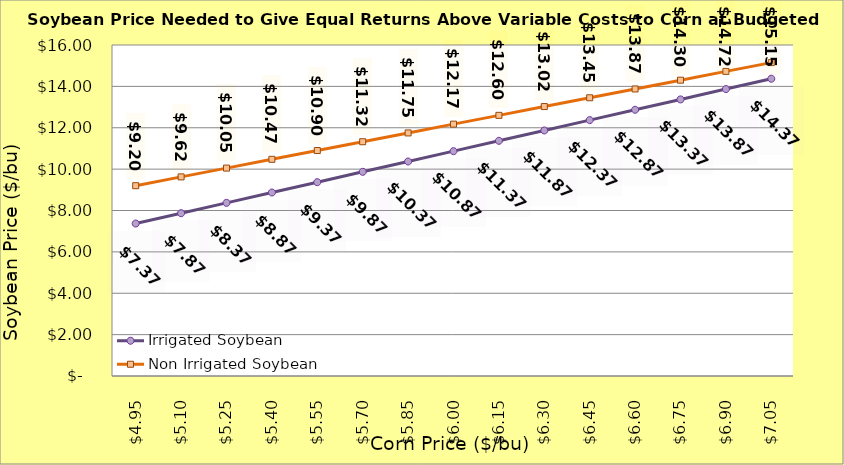
| Category | Irrigated Soybean | Non Irrigated Soybean |
|---|---|---|
| 4.9499999999999975 | 7.369 | 9.199 |
| 5.099999999999998 | 7.869 | 9.624 |
| 5.249999999999998 | 8.369 | 10.049 |
| 5.399999999999999 | 8.869 | 10.474 |
| 5.549999999999999 | 9.369 | 10.899 |
| 5.699999999999999 | 9.869 | 11.324 |
| 5.85 | 10.369 | 11.749 |
| 6.0 | 10.869 | 12.174 |
| 6.15 | 11.369 | 12.599 |
| 6.300000000000001 | 11.869 | 13.024 |
| 6.450000000000001 | 12.369 | 13.449 |
| 6.600000000000001 | 12.869 | 13.874 |
| 6.750000000000002 | 13.369 | 14.299 |
| 6.900000000000002 | 13.869 | 14.724 |
| 7.0500000000000025 | 14.369 | 15.149 |